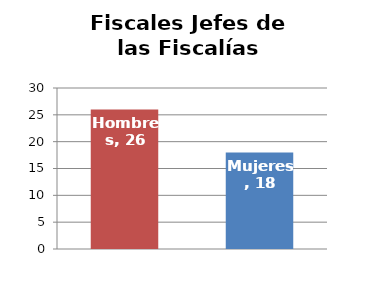
| Category | Fiscales Jefes de las Fiscalías Provinciales |
|---|---|
| Hombres | 26 |
| Mujeres | 18 |